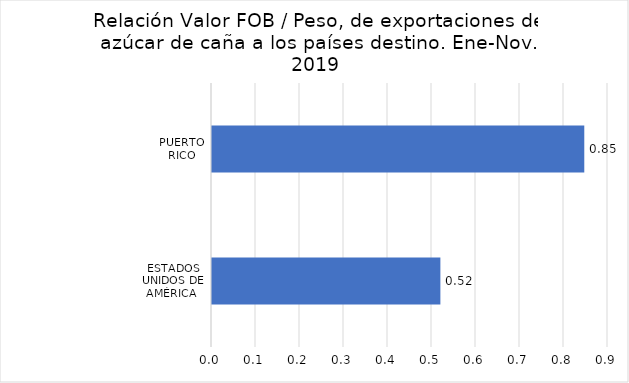
| Category | Series 0 |
|---|---|
| ESTADOS UNIDOS DE AMÉRICA  | 0.519 |
| PUERTO RICO | 0.846 |